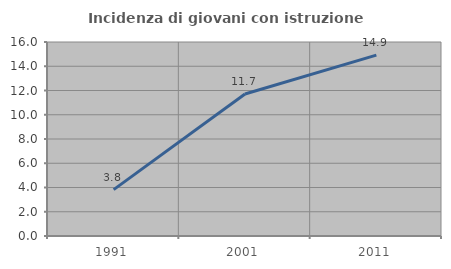
| Category | Incidenza di giovani con istruzione universitaria |
|---|---|
| 1991.0 | 3.828 |
| 2001.0 | 11.712 |
| 2011.0 | 14.917 |